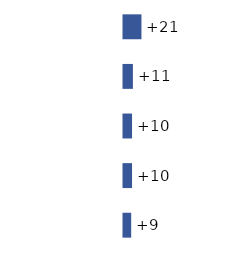
| Category | Series 0 |
|---|---|
| 0 | 21 |
| 1 | 11 |
| 2 | 10 |
| 3 | 10 |
| 4 | 9 |